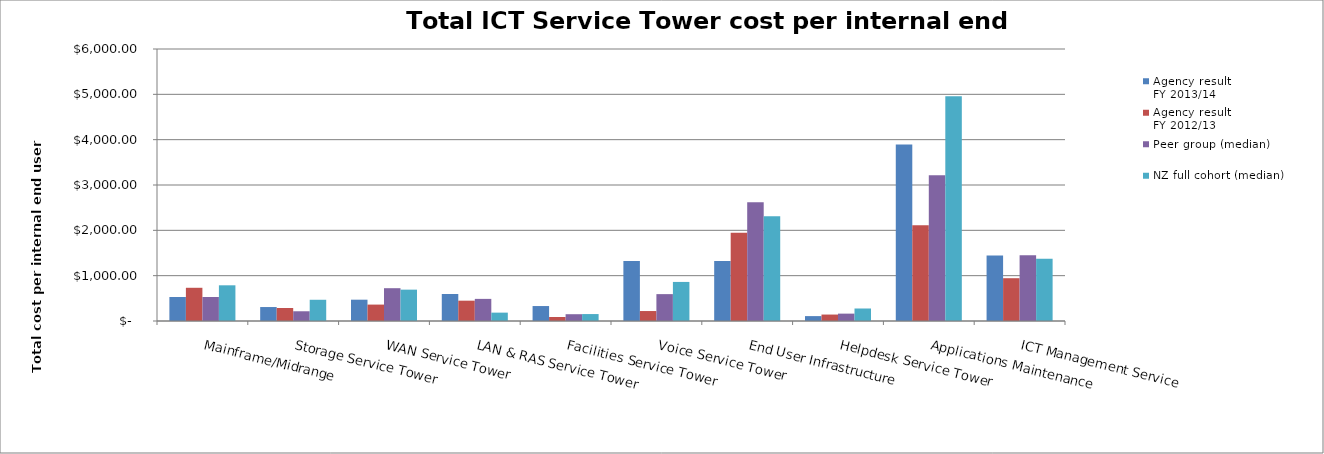
| Category | Agency result
FY 2013/14 | Agency result
FY 2012/13 | Peer group (median) | NZ full cohort (median) |
|---|---|---|---|---|
| Mainframe/Midrange | 530 | 732.759 | 530 | 787.407 |
| Storage Service Tower | 308 | 286.638 | 214.706 | 468.275 |
| WAN Service Tower | 470 | 362.069 | 723.577 | 691.603 |
| LAN & RAS Service Tower | 596 | 448.276 | 487.952 | 184.52 |
| Facilities Service Tower | 330 | 88.362 | 150 | 153.125 |
| Voice Service Tower | 1322 | 219.828 | 592.834 | 861.764 |
| End User Infrastructure | 1322 | 1946.121 | 2618.892 | 2310.534 |
| Helpdesk Service Tower | 108 | 142.241 | 162.602 | 275.846 |
| Applications Maintenance | 3896 | 2112.069 | 3212.5 | 4958.49 |
| ICT Management Service | 1444 | 943.966 | 1451.807 | 1372.868 |